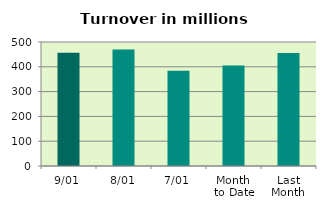
| Category | Series 0 |
|---|---|
| 9/01 | 456.623 |
| 8/01 | 470.047 |
| 7/01 | 383.864 |
| Month 
to Date | 405.172 |
| Last
Month | 455.699 |